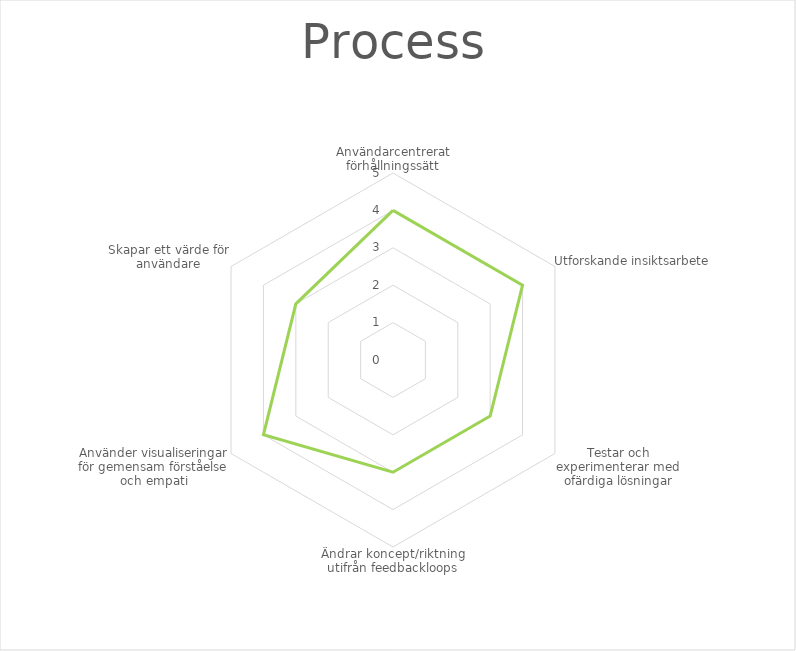
| Category | Series 0 |
|---|---|
| Användarcentrerat förhållningssätt | 4 |
| Utforskande insiktsarbete | 4 |
| Testar och experimenterar med ofärdiga lösningar | 3 |
| Ändrar koncept/riktning utifrån feedbackloops | 3 |
| Använder visualiseringar för gemensam förståelse och empati | 4 |
| Skapar ett värde för användare | 3 |